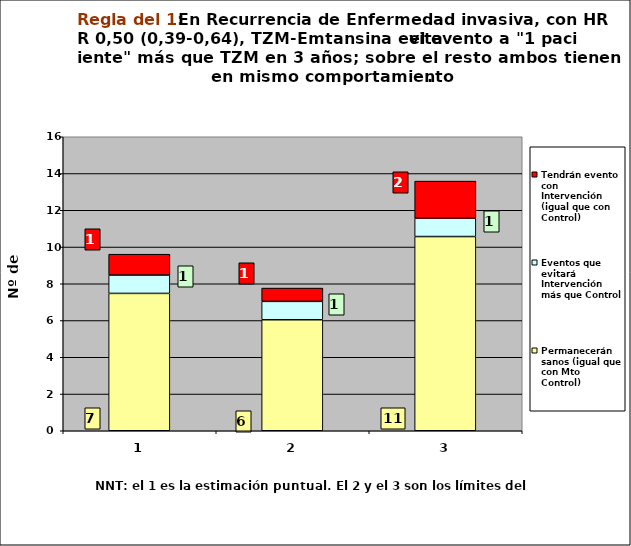
| Category | Permanecerán sanos (igual que con Mto Control) | Eventos que evitará Intervención más que Control | Tendrán evento con Intervención (igual que con Control) |
|---|---|---|---|
| 0 | 7.475 | 1 | 1.134 |
| 1 | 6.041 | 1 | 0.724 |
| 2 | 10.569 | 1 | 2.017 |